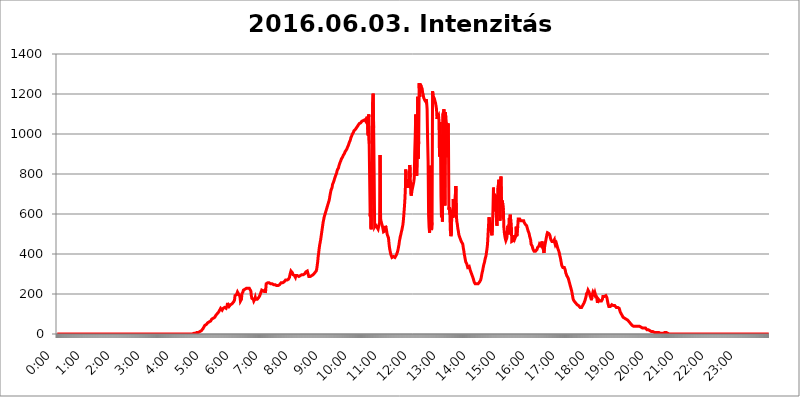
| Category | 2016.06.03. Intenzitás [W/m^2] |
|---|---|
| 0.0 | 0 |
| 0.0006944444444444445 | 0 |
| 0.001388888888888889 | 0 |
| 0.0020833333333333333 | 0 |
| 0.002777777777777778 | 0 |
| 0.003472222222222222 | 0 |
| 0.004166666666666667 | 0 |
| 0.004861111111111111 | 0 |
| 0.005555555555555556 | 0 |
| 0.0062499999999999995 | 0 |
| 0.006944444444444444 | 0 |
| 0.007638888888888889 | 0 |
| 0.008333333333333333 | 0 |
| 0.009027777777777779 | 0 |
| 0.009722222222222222 | 0 |
| 0.010416666666666666 | 0 |
| 0.011111111111111112 | 0 |
| 0.011805555555555555 | 0 |
| 0.012499999999999999 | 0 |
| 0.013194444444444444 | 0 |
| 0.013888888888888888 | 0 |
| 0.014583333333333332 | 0 |
| 0.015277777777777777 | 0 |
| 0.015972222222222224 | 0 |
| 0.016666666666666666 | 0 |
| 0.017361111111111112 | 0 |
| 0.018055555555555557 | 0 |
| 0.01875 | 0 |
| 0.019444444444444445 | 0 |
| 0.02013888888888889 | 0 |
| 0.020833333333333332 | 0 |
| 0.02152777777777778 | 0 |
| 0.022222222222222223 | 0 |
| 0.02291666666666667 | 0 |
| 0.02361111111111111 | 0 |
| 0.024305555555555556 | 0 |
| 0.024999999999999998 | 0 |
| 0.025694444444444447 | 0 |
| 0.02638888888888889 | 0 |
| 0.027083333333333334 | 0 |
| 0.027777777777777776 | 0 |
| 0.02847222222222222 | 0 |
| 0.029166666666666664 | 0 |
| 0.029861111111111113 | 0 |
| 0.030555555555555555 | 0 |
| 0.03125 | 0 |
| 0.03194444444444445 | 0 |
| 0.03263888888888889 | 0 |
| 0.03333333333333333 | 0 |
| 0.034027777777777775 | 0 |
| 0.034722222222222224 | 0 |
| 0.035416666666666666 | 0 |
| 0.036111111111111115 | 0 |
| 0.03680555555555556 | 0 |
| 0.0375 | 0 |
| 0.03819444444444444 | 0 |
| 0.03888888888888889 | 0 |
| 0.03958333333333333 | 0 |
| 0.04027777777777778 | 0 |
| 0.04097222222222222 | 0 |
| 0.041666666666666664 | 0 |
| 0.042361111111111106 | 0 |
| 0.04305555555555556 | 0 |
| 0.043750000000000004 | 0 |
| 0.044444444444444446 | 0 |
| 0.04513888888888889 | 0 |
| 0.04583333333333334 | 0 |
| 0.04652777777777778 | 0 |
| 0.04722222222222222 | 0 |
| 0.04791666666666666 | 0 |
| 0.04861111111111111 | 0 |
| 0.049305555555555554 | 0 |
| 0.049999999999999996 | 0 |
| 0.05069444444444445 | 0 |
| 0.051388888888888894 | 0 |
| 0.052083333333333336 | 0 |
| 0.05277777777777778 | 0 |
| 0.05347222222222222 | 0 |
| 0.05416666666666667 | 0 |
| 0.05486111111111111 | 0 |
| 0.05555555555555555 | 0 |
| 0.05625 | 0 |
| 0.05694444444444444 | 0 |
| 0.057638888888888885 | 0 |
| 0.05833333333333333 | 0 |
| 0.05902777777777778 | 0 |
| 0.059722222222222225 | 0 |
| 0.06041666666666667 | 0 |
| 0.061111111111111116 | 0 |
| 0.06180555555555556 | 0 |
| 0.0625 | 0 |
| 0.06319444444444444 | 0 |
| 0.06388888888888888 | 0 |
| 0.06458333333333334 | 0 |
| 0.06527777777777778 | 0 |
| 0.06597222222222222 | 0 |
| 0.06666666666666667 | 0 |
| 0.06736111111111111 | 0 |
| 0.06805555555555555 | 0 |
| 0.06874999999999999 | 0 |
| 0.06944444444444443 | 0 |
| 0.07013888888888889 | 0 |
| 0.07083333333333333 | 0 |
| 0.07152777777777779 | 0 |
| 0.07222222222222223 | 0 |
| 0.07291666666666667 | 0 |
| 0.07361111111111111 | 0 |
| 0.07430555555555556 | 0 |
| 0.075 | 0 |
| 0.07569444444444444 | 0 |
| 0.0763888888888889 | 0 |
| 0.07708333333333334 | 0 |
| 0.07777777777777778 | 0 |
| 0.07847222222222222 | 0 |
| 0.07916666666666666 | 0 |
| 0.0798611111111111 | 0 |
| 0.08055555555555556 | 0 |
| 0.08125 | 0 |
| 0.08194444444444444 | 0 |
| 0.08263888888888889 | 0 |
| 0.08333333333333333 | 0 |
| 0.08402777777777777 | 0 |
| 0.08472222222222221 | 0 |
| 0.08541666666666665 | 0 |
| 0.08611111111111112 | 0 |
| 0.08680555555555557 | 0 |
| 0.08750000000000001 | 0 |
| 0.08819444444444445 | 0 |
| 0.08888888888888889 | 0 |
| 0.08958333333333333 | 0 |
| 0.09027777777777778 | 0 |
| 0.09097222222222222 | 0 |
| 0.09166666666666667 | 0 |
| 0.09236111111111112 | 0 |
| 0.09305555555555556 | 0 |
| 0.09375 | 0 |
| 0.09444444444444444 | 0 |
| 0.09513888888888888 | 0 |
| 0.09583333333333333 | 0 |
| 0.09652777777777777 | 0 |
| 0.09722222222222222 | 0 |
| 0.09791666666666667 | 0 |
| 0.09861111111111111 | 0 |
| 0.09930555555555555 | 0 |
| 0.09999999999999999 | 0 |
| 0.10069444444444443 | 0 |
| 0.1013888888888889 | 0 |
| 0.10208333333333335 | 0 |
| 0.10277777777777779 | 0 |
| 0.10347222222222223 | 0 |
| 0.10416666666666667 | 0 |
| 0.10486111111111111 | 0 |
| 0.10555555555555556 | 0 |
| 0.10625 | 0 |
| 0.10694444444444444 | 0 |
| 0.1076388888888889 | 0 |
| 0.10833333333333334 | 0 |
| 0.10902777777777778 | 0 |
| 0.10972222222222222 | 0 |
| 0.1111111111111111 | 0 |
| 0.11180555555555556 | 0 |
| 0.11180555555555556 | 0 |
| 0.1125 | 0 |
| 0.11319444444444444 | 0 |
| 0.11388888888888889 | 0 |
| 0.11458333333333333 | 0 |
| 0.11527777777777777 | 0 |
| 0.11597222222222221 | 0 |
| 0.11666666666666665 | 0 |
| 0.1173611111111111 | 0 |
| 0.11805555555555557 | 0 |
| 0.11944444444444445 | 0 |
| 0.12013888888888889 | 0 |
| 0.12083333333333333 | 0 |
| 0.12152777777777778 | 0 |
| 0.12222222222222223 | 0 |
| 0.12291666666666667 | 0 |
| 0.12291666666666667 | 0 |
| 0.12361111111111112 | 0 |
| 0.12430555555555556 | 0 |
| 0.125 | 0 |
| 0.12569444444444444 | 0 |
| 0.12638888888888888 | 0 |
| 0.12708333333333333 | 0 |
| 0.16875 | 0 |
| 0.12847222222222224 | 0 |
| 0.12916666666666668 | 0 |
| 0.12986111111111112 | 0 |
| 0.13055555555555556 | 0 |
| 0.13125 | 0 |
| 0.13194444444444445 | 0 |
| 0.1326388888888889 | 0 |
| 0.13333333333333333 | 0 |
| 0.13402777777777777 | 0 |
| 0.13402777777777777 | 0 |
| 0.13472222222222222 | 0 |
| 0.13541666666666666 | 0 |
| 0.1361111111111111 | 0 |
| 0.13749999999999998 | 0 |
| 0.13819444444444443 | 0 |
| 0.1388888888888889 | 0 |
| 0.13958333333333334 | 0 |
| 0.14027777777777778 | 0 |
| 0.14097222222222222 | 0 |
| 0.14166666666666666 | 0 |
| 0.1423611111111111 | 0 |
| 0.14305555555555557 | 0 |
| 0.14375000000000002 | 0 |
| 0.14444444444444446 | 0 |
| 0.1451388888888889 | 0 |
| 0.1451388888888889 | 0 |
| 0.14652777777777778 | 0 |
| 0.14722222222222223 | 0 |
| 0.14791666666666667 | 0 |
| 0.1486111111111111 | 0 |
| 0.14930555555555555 | 0 |
| 0.15 | 0 |
| 0.15069444444444444 | 0 |
| 0.15138888888888888 | 0 |
| 0.15208333333333332 | 0 |
| 0.15277777777777776 | 0 |
| 0.15347222222222223 | 0 |
| 0.15416666666666667 | 0 |
| 0.15486111111111112 | 0 |
| 0.15555555555555556 | 0 |
| 0.15625 | 0 |
| 0.15694444444444444 | 0 |
| 0.15763888888888888 | 0 |
| 0.15833333333333333 | 0 |
| 0.15902777777777777 | 0 |
| 0.15972222222222224 | 0 |
| 0.16041666666666668 | 0 |
| 0.16111111111111112 | 0 |
| 0.16180555555555556 | 0 |
| 0.1625 | 0 |
| 0.16319444444444445 | 0 |
| 0.1638888888888889 | 0 |
| 0.16458333333333333 | 0 |
| 0.16527777777777777 | 0 |
| 0.16597222222222222 | 0 |
| 0.16666666666666666 | 0 |
| 0.1673611111111111 | 0 |
| 0.16805555555555554 | 0 |
| 0.16874999999999998 | 0 |
| 0.16944444444444443 | 0 |
| 0.17013888888888887 | 0 |
| 0.1708333333333333 | 0 |
| 0.17152777777777775 | 0 |
| 0.17222222222222225 | 0 |
| 0.1729166666666667 | 0 |
| 0.17361111111111113 | 0 |
| 0.17430555555555557 | 0 |
| 0.17500000000000002 | 0 |
| 0.17569444444444446 | 0 |
| 0.1763888888888889 | 0 |
| 0.17708333333333334 | 0 |
| 0.17777777777777778 | 0 |
| 0.17847222222222223 | 0 |
| 0.17916666666666667 | 0 |
| 0.1798611111111111 | 0 |
| 0.18055555555555555 | 0 |
| 0.18125 | 0 |
| 0.18194444444444444 | 0 |
| 0.1826388888888889 | 0 |
| 0.18333333333333335 | 0 |
| 0.1840277777777778 | 0 |
| 0.18472222222222223 | 0 |
| 0.18541666666666667 | 0 |
| 0.18611111111111112 | 0 |
| 0.18680555555555556 | 0 |
| 0.1875 | 0 |
| 0.18819444444444444 | 0 |
| 0.18888888888888888 | 0 |
| 0.18958333333333333 | 0 |
| 0.19027777777777777 | 0 |
| 0.1909722222222222 | 0 |
| 0.19166666666666665 | 3.525 |
| 0.19236111111111112 | 3.525 |
| 0.19305555555555554 | 3.525 |
| 0.19375 | 3.525 |
| 0.19444444444444445 | 3.525 |
| 0.1951388888888889 | 7.887 |
| 0.19583333333333333 | 7.887 |
| 0.19652777777777777 | 7.887 |
| 0.19722222222222222 | 7.887 |
| 0.19791666666666666 | 7.887 |
| 0.1986111111111111 | 7.887 |
| 0.19930555555555554 | 12.257 |
| 0.19999999999999998 | 12.257 |
| 0.20069444444444443 | 12.257 |
| 0.20138888888888887 | 12.257 |
| 0.2020833333333333 | 16.636 |
| 0.2027777777777778 | 16.636 |
| 0.2034722222222222 | 21.024 |
| 0.2041666666666667 | 25.419 |
| 0.20486111111111113 | 29.823 |
| 0.20555555555555557 | 34.234 |
| 0.20625000000000002 | 38.653 |
| 0.20694444444444446 | 43.079 |
| 0.2076388888888889 | 47.511 |
| 0.20833333333333334 | 47.511 |
| 0.20902777777777778 | 47.511 |
| 0.20972222222222223 | 51.951 |
| 0.21041666666666667 | 51.951 |
| 0.2111111111111111 | 56.398 |
| 0.21180555555555555 | 60.85 |
| 0.2125 | 60.85 |
| 0.21319444444444444 | 60.85 |
| 0.2138888888888889 | 60.85 |
| 0.21458333333333335 | 65.31 |
| 0.2152777777777778 | 65.31 |
| 0.21597222222222223 | 69.775 |
| 0.21666666666666667 | 74.246 |
| 0.21736111111111112 | 74.246 |
| 0.21805555555555556 | 78.722 |
| 0.21875 | 78.722 |
| 0.21944444444444444 | 78.722 |
| 0.22013888888888888 | 78.722 |
| 0.22083333333333333 | 83.205 |
| 0.22152777777777777 | 87.692 |
| 0.2222222222222222 | 92.184 |
| 0.22291666666666665 | 92.184 |
| 0.2236111111111111 | 96.682 |
| 0.22430555555555556 | 101.184 |
| 0.225 | 101.184 |
| 0.22569444444444445 | 105.69 |
| 0.2263888888888889 | 110.201 |
| 0.22708333333333333 | 114.716 |
| 0.22777777777777777 | 119.235 |
| 0.22847222222222222 | 123.758 |
| 0.22916666666666666 | 128.284 |
| 0.2298611111111111 | 132.814 |
| 0.23055555555555554 | 123.758 |
| 0.23124999999999998 | 119.235 |
| 0.23194444444444443 | 123.758 |
| 0.23263888888888887 | 128.284 |
| 0.2333333333333333 | 132.814 |
| 0.2340277777777778 | 128.284 |
| 0.2347222222222222 | 132.814 |
| 0.2354166666666667 | 128.284 |
| 0.23611111111111113 | 128.284 |
| 0.23680555555555557 | 128.284 |
| 0.23750000000000002 | 132.814 |
| 0.23819444444444446 | 141.884 |
| 0.2388888888888889 | 155.509 |
| 0.23958333333333334 | 146.423 |
| 0.24027777777777778 | 141.884 |
| 0.24097222222222223 | 137.347 |
| 0.24166666666666667 | 137.347 |
| 0.2423611111111111 | 141.884 |
| 0.24305555555555555 | 146.423 |
| 0.24375 | 146.423 |
| 0.24444444444444446 | 150.964 |
| 0.24513888888888888 | 150.964 |
| 0.24583333333333335 | 155.509 |
| 0.2465277777777778 | 155.509 |
| 0.24722222222222223 | 160.056 |
| 0.24791666666666667 | 160.056 |
| 0.24861111111111112 | 169.156 |
| 0.24930555555555556 | 191.937 |
| 0.25 | 191.937 |
| 0.25069444444444444 | 191.937 |
| 0.2513888888888889 | 196.497 |
| 0.2520833333333333 | 201.058 |
| 0.25277777777777777 | 210.182 |
| 0.2534722222222222 | 210.182 |
| 0.25416666666666665 | 205.62 |
| 0.2548611111111111 | 196.497 |
| 0.2555555555555556 | 196.497 |
| 0.25625000000000003 | 187.378 |
| 0.2569444444444445 | 164.605 |
| 0.2576388888888889 | 169.156 |
| 0.25833333333333336 | 173.709 |
| 0.2590277777777778 | 201.058 |
| 0.25972222222222224 | 201.058 |
| 0.2604166666666667 | 210.182 |
| 0.2611111111111111 | 219.309 |
| 0.26180555555555557 | 219.309 |
| 0.2625 | 223.873 |
| 0.26319444444444445 | 223.873 |
| 0.2638888888888889 | 228.436 |
| 0.26458333333333334 | 228.436 |
| 0.2652777777777778 | 228.436 |
| 0.2659722222222222 | 228.436 |
| 0.26666666666666666 | 228.436 |
| 0.2673611111111111 | 228.436 |
| 0.26805555555555555 | 228.436 |
| 0.26875 | 228.436 |
| 0.26944444444444443 | 228.436 |
| 0.2701388888888889 | 228.436 |
| 0.2708333333333333 | 223.873 |
| 0.27152777777777776 | 214.746 |
| 0.2722222222222222 | 191.937 |
| 0.27291666666666664 | 178.264 |
| 0.2736111111111111 | 173.709 |
| 0.2743055555555555 | 173.709 |
| 0.27499999999999997 | 173.709 |
| 0.27569444444444446 | 164.605 |
| 0.27638888888888885 | 169.156 |
| 0.27708333333333335 | 173.709 |
| 0.2777777777777778 | 182.82 |
| 0.27847222222222223 | 173.709 |
| 0.2791666666666667 | 169.156 |
| 0.2798611111111111 | 169.156 |
| 0.28055555555555556 | 173.709 |
| 0.28125 | 173.709 |
| 0.28194444444444444 | 178.264 |
| 0.2826388888888889 | 182.82 |
| 0.2833333333333333 | 187.378 |
| 0.28402777777777777 | 191.937 |
| 0.2847222222222222 | 196.497 |
| 0.28541666666666665 | 205.62 |
| 0.28611111111111115 | 210.182 |
| 0.28680555555555554 | 219.309 |
| 0.28750000000000003 | 219.309 |
| 0.2881944444444445 | 219.309 |
| 0.2888888888888889 | 214.746 |
| 0.28958333333333336 | 210.182 |
| 0.2902777777777778 | 219.309 |
| 0.29097222222222224 | 219.309 |
| 0.2916666666666667 | 205.62 |
| 0.2923611111111111 | 219.309 |
| 0.29305555555555557 | 251.251 |
| 0.29375 | 251.251 |
| 0.29444444444444445 | 255.813 |
| 0.2951388888888889 | 255.813 |
| 0.29583333333333334 | 255.813 |
| 0.2965277777777778 | 255.813 |
| 0.2972222222222222 | 255.813 |
| 0.29791666666666666 | 251.251 |
| 0.2986111111111111 | 251.251 |
| 0.29930555555555555 | 251.251 |
| 0.3 | 251.251 |
| 0.30069444444444443 | 246.689 |
| 0.3013888888888889 | 251.251 |
| 0.3020833333333333 | 251.251 |
| 0.30277777777777776 | 251.251 |
| 0.3034722222222222 | 246.689 |
| 0.30416666666666664 | 246.689 |
| 0.3048611111111111 | 246.689 |
| 0.3055555555555555 | 246.689 |
| 0.30624999999999997 | 242.127 |
| 0.3069444444444444 | 242.127 |
| 0.3076388888888889 | 242.127 |
| 0.30833333333333335 | 242.127 |
| 0.3090277777777778 | 242.127 |
| 0.30972222222222223 | 242.127 |
| 0.3104166666666667 | 246.689 |
| 0.3111111111111111 | 246.689 |
| 0.31180555555555556 | 246.689 |
| 0.3125 | 251.251 |
| 0.31319444444444444 | 251.251 |
| 0.3138888888888889 | 255.813 |
| 0.3145833333333333 | 255.813 |
| 0.31527777777777777 | 255.813 |
| 0.3159722222222222 | 255.813 |
| 0.31666666666666665 | 260.373 |
| 0.31736111111111115 | 260.373 |
| 0.31805555555555554 | 260.373 |
| 0.31875000000000003 | 260.373 |
| 0.3194444444444445 | 264.932 |
| 0.3201388888888889 | 269.49 |
| 0.32083333333333336 | 269.49 |
| 0.3215277777777778 | 269.49 |
| 0.32222222222222224 | 269.49 |
| 0.3229166666666667 | 274.047 |
| 0.3236111111111111 | 274.047 |
| 0.32430555555555557 | 274.047 |
| 0.325 | 278.603 |
| 0.32569444444444445 | 283.156 |
| 0.3263888888888889 | 296.808 |
| 0.32708333333333334 | 305.898 |
| 0.3277777777777778 | 314.98 |
| 0.3284722222222222 | 319.517 |
| 0.32916666666666666 | 314.98 |
| 0.3298611111111111 | 305.898 |
| 0.33055555555555555 | 296.808 |
| 0.33125 | 292.259 |
| 0.33194444444444443 | 292.259 |
| 0.3326388888888889 | 292.259 |
| 0.3333333333333333 | 292.259 |
| 0.3340277777777778 | 283.156 |
| 0.3347222222222222 | 292.259 |
| 0.3354166666666667 | 292.259 |
| 0.3361111111111111 | 292.259 |
| 0.3368055555555556 | 292.259 |
| 0.33749999999999997 | 287.709 |
| 0.33819444444444446 | 287.709 |
| 0.33888888888888885 | 287.709 |
| 0.33958333333333335 | 287.709 |
| 0.34027777777777773 | 287.709 |
| 0.34097222222222223 | 292.259 |
| 0.3416666666666666 | 292.259 |
| 0.3423611111111111 | 292.259 |
| 0.3430555555555555 | 296.808 |
| 0.34375 | 296.808 |
| 0.3444444444444445 | 301.354 |
| 0.3451388888888889 | 296.808 |
| 0.3458333333333334 | 301.354 |
| 0.34652777777777777 | 301.354 |
| 0.34722222222222227 | 301.354 |
| 0.34791666666666665 | 305.898 |
| 0.34861111111111115 | 310.44 |
| 0.34930555555555554 | 314.98 |
| 0.35000000000000003 | 314.98 |
| 0.3506944444444444 | 314.98 |
| 0.3513888888888889 | 310.44 |
| 0.3520833333333333 | 310.44 |
| 0.3527777777777778 | 287.709 |
| 0.3534722222222222 | 292.259 |
| 0.3541666666666667 | 292.259 |
| 0.3548611111111111 | 287.709 |
| 0.35555555555555557 | 292.259 |
| 0.35625 | 292.259 |
| 0.35694444444444445 | 292.259 |
| 0.3576388888888889 | 292.259 |
| 0.35833333333333334 | 296.808 |
| 0.3590277777777778 | 296.808 |
| 0.3597222222222222 | 301.354 |
| 0.36041666666666666 | 301.354 |
| 0.3611111111111111 | 305.898 |
| 0.36180555555555555 | 310.44 |
| 0.3625 | 310.44 |
| 0.36319444444444443 | 314.98 |
| 0.3638888888888889 | 324.052 |
| 0.3645833333333333 | 342.162 |
| 0.3652777777777778 | 360.221 |
| 0.3659722222222222 | 387.202 |
| 0.3666666666666667 | 405.108 |
| 0.3673611111111111 | 427.39 |
| 0.3680555555555556 | 445.129 |
| 0.36874999999999997 | 458.38 |
| 0.36944444444444446 | 471.582 |
| 0.37013888888888885 | 489.108 |
| 0.37083333333333335 | 506.542 |
| 0.37152777777777773 | 523.88 |
| 0.37222222222222223 | 541.121 |
| 0.3729166666666666 | 558.261 |
| 0.3736111111111111 | 571.049 |
| 0.3743055555555555 | 583.779 |
| 0.375 | 592.233 |
| 0.3756944444444445 | 596.45 |
| 0.3763888888888889 | 609.062 |
| 0.3770833333333334 | 617.436 |
| 0.37777777777777777 | 625.784 |
| 0.37847222222222227 | 629.948 |
| 0.37916666666666665 | 642.4 |
| 0.37986111111111115 | 650.667 |
| 0.38055555555555554 | 658.909 |
| 0.38125000000000003 | 667.123 |
| 0.3819444444444444 | 679.395 |
| 0.3826388888888889 | 695.666 |
| 0.3833333333333333 | 707.8 |
| 0.3840277777777778 | 719.877 |
| 0.3847222222222222 | 723.889 |
| 0.3854166666666667 | 731.896 |
| 0.3861111111111111 | 747.834 |
| 0.38680555555555557 | 751.803 |
| 0.3875 | 759.723 |
| 0.38819444444444445 | 767.62 |
| 0.3888888888888889 | 775.492 |
| 0.38958333333333334 | 783.342 |
| 0.3902777777777778 | 791.169 |
| 0.3909722222222222 | 795.074 |
| 0.39166666666666666 | 802.868 |
| 0.3923611111111111 | 814.519 |
| 0.39305555555555555 | 822.26 |
| 0.39375 | 826.123 |
| 0.39444444444444443 | 829.981 |
| 0.3951388888888889 | 841.526 |
| 0.3958333333333333 | 849.199 |
| 0.3965277777777778 | 856.855 |
| 0.3972222222222222 | 860.676 |
| 0.3979166666666667 | 868.305 |
| 0.3986111111111111 | 875.918 |
| 0.3993055555555556 | 879.719 |
| 0.39999999999999997 | 883.516 |
| 0.40069444444444446 | 887.309 |
| 0.40138888888888885 | 894.885 |
| 0.40208333333333335 | 898.668 |
| 0.40277777777777773 | 902.447 |
| 0.40347222222222223 | 909.996 |
| 0.4041666666666666 | 913.766 |
| 0.4048611111111111 | 917.534 |
| 0.4055555555555555 | 921.298 |
| 0.40625 | 925.06 |
| 0.4069444444444445 | 932.576 |
| 0.4076388888888889 | 932.576 |
| 0.4083333333333334 | 943.832 |
| 0.40902777777777777 | 947.58 |
| 0.40972222222222227 | 958.814 |
| 0.41041666666666665 | 962.555 |
| 0.41111111111111115 | 970.034 |
| 0.41180555555555554 | 981.244 |
| 0.41250000000000003 | 984.98 |
| 0.4131944444444444 | 992.448 |
| 0.4138888888888889 | 999.916 |
| 0.4145833333333333 | 1003.65 |
| 0.4152777777777778 | 1007.383 |
| 0.4159722222222222 | 1014.852 |
| 0.4166666666666667 | 1014.852 |
| 0.4173611111111111 | 1018.587 |
| 0.41805555555555557 | 1022.323 |
| 0.41875 | 1026.06 |
| 0.41944444444444445 | 1029.798 |
| 0.4201388888888889 | 1029.798 |
| 0.42083333333333334 | 1037.277 |
| 0.4215277777777778 | 1041.019 |
| 0.4222222222222222 | 1044.762 |
| 0.42291666666666666 | 1048.508 |
| 0.4236111111111111 | 1052.255 |
| 0.42430555555555555 | 1056.004 |
| 0.425 | 1056.004 |
| 0.42569444444444443 | 1056.004 |
| 0.4263888888888889 | 1059.756 |
| 0.4270833333333333 | 1063.51 |
| 0.4277777777777778 | 1059.756 |
| 0.4284722222222222 | 1059.756 |
| 0.4291666666666667 | 1067.267 |
| 0.4298611111111111 | 1067.267 |
| 0.4305555555555556 | 1071.027 |
| 0.43124999999999997 | 1071.027 |
| 0.43194444444444446 | 1071.027 |
| 0.43263888888888885 | 1063.51 |
| 0.43333333333333335 | 1074.789 |
| 0.43402777777777773 | 1078.555 |
| 0.43472222222222223 | 1086.097 |
| 0.4354166666666666 | 1089.873 |
| 0.4361111111111111 | 992.448 |
| 0.4368055555555555 | 1097.437 |
| 0.4375 | 951.327 |
| 0.4381944444444445 | 955.071 |
| 0.4388888888888889 | 588.009 |
| 0.4395833333333334 | 625.784 |
| 0.44027777777777777 | 523.88 |
| 0.44097222222222227 | 860.676 |
| 0.44166666666666665 | 675.311 |
| 0.44236111111111115 | 1158.689 |
| 0.44305555555555554 | 1201.843 |
| 0.44375000000000003 | 1029.798 |
| 0.4444444444444444 | 814.519 |
| 0.4451388888888889 | 536.82 |
| 0.4458333333333333 | 536.82 |
| 0.4465277777777778 | 545.416 |
| 0.4472222222222222 | 545.416 |
| 0.4479166666666667 | 541.121 |
| 0.4486111111111111 | 532.513 |
| 0.44930555555555557 | 528.2 |
| 0.45 | 523.88 |
| 0.45069444444444445 | 523.88 |
| 0.4513888888888889 | 528.2 |
| 0.45208333333333334 | 558.261 |
| 0.4527777777777778 | 894.885 |
| 0.4534722222222222 | 579.542 |
| 0.45416666666666666 | 562.53 |
| 0.4548611111111111 | 558.261 |
| 0.45555555555555555 | 545.416 |
| 0.45625 | 536.82 |
| 0.45694444444444443 | 523.88 |
| 0.4576388888888889 | 510.885 |
| 0.4583333333333333 | 515.223 |
| 0.4590277777777778 | 510.885 |
| 0.4597222222222222 | 515.223 |
| 0.4604166666666667 | 541.121 |
| 0.4611111111111111 | 532.513 |
| 0.4618055555555556 | 519.555 |
| 0.46249999999999997 | 502.192 |
| 0.46319444444444446 | 493.475 |
| 0.46388888888888885 | 489.108 |
| 0.46458333333333335 | 480.356 |
| 0.46527777777777773 | 453.968 |
| 0.46597222222222223 | 431.833 |
| 0.4666666666666666 | 418.492 |
| 0.4673611111111111 | 405.108 |
| 0.4680555555555555 | 396.164 |
| 0.46875 | 391.685 |
| 0.4694444444444445 | 382.715 |
| 0.4701388888888889 | 382.715 |
| 0.4708333333333334 | 382.715 |
| 0.47152777777777777 | 387.202 |
| 0.47222222222222227 | 382.715 |
| 0.47291666666666665 | 382.715 |
| 0.47361111111111115 | 382.715 |
| 0.47430555555555554 | 382.715 |
| 0.47500000000000003 | 387.202 |
| 0.4756944444444444 | 396.164 |
| 0.4763888888888889 | 400.638 |
| 0.4770833333333333 | 409.574 |
| 0.4777777777777778 | 418.492 |
| 0.4784722222222222 | 431.833 |
| 0.4791666666666667 | 445.129 |
| 0.4798611111111111 | 462.786 |
| 0.48055555555555557 | 475.972 |
| 0.48125 | 489.108 |
| 0.48194444444444445 | 497.836 |
| 0.4826388888888889 | 510.885 |
| 0.48333333333333334 | 519.555 |
| 0.4840277777777778 | 532.513 |
| 0.4847222222222222 | 545.416 |
| 0.48541666666666666 | 566.793 |
| 0.4861111111111111 | 596.45 |
| 0.48680555555555555 | 629.948 |
| 0.4875 | 667.123 |
| 0.48819444444444443 | 719.877 |
| 0.4888888888888889 | 822.26 |
| 0.4895833333333333 | 739.877 |
| 0.4902777777777778 | 731.896 |
| 0.4909722222222222 | 743.859 |
| 0.4916666666666667 | 775.492 |
| 0.4923611111111111 | 739.877 |
| 0.4930555555555556 | 731.896 |
| 0.49374999999999997 | 755.766 |
| 0.49444444444444446 | 845.365 |
| 0.49513888888888885 | 783.342 |
| 0.49583333333333335 | 703.762 |
| 0.49652777777777773 | 691.608 |
| 0.49722222222222223 | 711.832 |
| 0.4979166666666666 | 723.889 |
| 0.4986111111111111 | 735.89 |
| 0.4993055555555555 | 731.896 |
| 0.5 | 759.723 |
| 0.5006944444444444 | 779.42 |
| 0.5013888888888889 | 909.996 |
| 0.5020833333333333 | 988.714 |
| 0.5027777777777778 | 1097.437 |
| 0.5034722222222222 | 999.916 |
| 0.5041666666666667 | 791.169 |
| 0.5048611111111111 | 917.534 |
| 0.5055555555555555 | 1186.03 |
| 0.50625 | 875.918 |
| 0.5069444444444444 | 962.555 |
| 0.5076388888888889 | 1254.387 |
| 0.5083333333333333 | 1186.03 |
| 0.5090277777777777 | 1250.275 |
| 0.5097222222222222 | 1246.176 |
| 0.5104166666666666 | 1238.014 |
| 0.5111111111111112 | 1233.951 |
| 0.5118055555555555 | 1225.859 |
| 0.5125000000000001 | 1205.82 |
| 0.5131944444444444 | 1197.876 |
| 0.513888888888889 | 1182.099 |
| 0.5145833333333333 | 1182.099 |
| 0.5152777777777778 | 1170.358 |
| 0.5159722222222222 | 1170.358 |
| 0.5166666666666667 | 1162.571 |
| 0.517361111111111 | 1174.263 |
| 0.5180555555555556 | 1158.689 |
| 0.5187499999999999 | 1124.056 |
| 0.5194444444444445 | 973.772 |
| 0.5201388888888888 | 864.493 |
| 0.5208333333333334 | 592.233 |
| 0.5215277777777778 | 532.513 |
| 0.5222222222222223 | 506.542 |
| 0.5229166666666667 | 506.542 |
| 0.5236111111111111 | 841.526 |
| 0.5243055555555556 | 532.513 |
| 0.525 | 519.555 |
| 0.5256944444444445 | 558.261 |
| 0.5263888888888889 | 1213.804 |
| 0.5270833333333333 | 1193.918 |
| 0.5277777777777778 | 1186.03 |
| 0.5284722222222222 | 1186.03 |
| 0.5291666666666667 | 1174.263 |
| 0.5298611111111111 | 1162.571 |
| 0.5305555555555556 | 1154.814 |
| 0.53125 | 1150.946 |
| 0.5319444444444444 | 1124.056 |
| 0.5326388888888889 | 1074.789 |
| 0.5333333333333333 | 1086.097 |
| 0.5340277777777778 | 1086.097 |
| 0.5347222222222222 | 1093.653 |
| 0.5354166666666667 | 1067.267 |
| 0.5361111111111111 | 887.309 |
| 0.5368055555555555 | 1059.756 |
| 0.5375 | 962.555 |
| 0.5381944444444444 | 687.544 |
| 0.5388888888888889 | 583.779 |
| 0.5395833333333333 | 996.182 |
| 0.5402777777777777 | 562.53 |
| 0.5409722222222222 | 1101.226 |
| 0.5416666666666666 | 1108.816 |
| 0.5423611111111112 | 1124.056 |
| 0.5430555555555555 | 849.199 |
| 0.5437500000000001 | 642.4 |
| 0.5444444444444444 | 1108.816 |
| 0.545138888888889 | 1067.267 |
| 0.5458333333333333 | 1056.004 |
| 0.5465277777777778 | 1048.508 |
| 0.5472222222222222 | 883.516 |
| 0.5479166666666667 | 1052.255 |
| 0.548611111111111 | 1041.019 |
| 0.5493055555555556 | 621.613 |
| 0.5499999999999999 | 634.105 |
| 0.5506944444444445 | 596.45 |
| 0.5513888888888888 | 515.223 |
| 0.5520833333333334 | 489.108 |
| 0.5527777777777778 | 502.192 |
| 0.5534722222222223 | 621.613 |
| 0.5541666666666667 | 600.661 |
| 0.5548611111111111 | 579.542 |
| 0.5555555555555556 | 675.311 |
| 0.55625 | 646.537 |
| 0.5569444444444445 | 588.009 |
| 0.5576388888888889 | 592.233 |
| 0.5583333333333333 | 588.009 |
| 0.5590277777777778 | 739.877 |
| 0.5597222222222222 | 596.45 |
| 0.5604166666666667 | 562.53 |
| 0.5611111111111111 | 549.704 |
| 0.5618055555555556 | 528.2 |
| 0.5625 | 515.223 |
| 0.5631944444444444 | 497.836 |
| 0.5638888888888889 | 489.108 |
| 0.5645833333333333 | 484.735 |
| 0.5652777777777778 | 475.972 |
| 0.5659722222222222 | 471.582 |
| 0.5666666666666667 | 462.786 |
| 0.5673611111111111 | 462.786 |
| 0.5680555555555555 | 458.38 |
| 0.56875 | 449.551 |
| 0.5694444444444444 | 431.833 |
| 0.5701388888888889 | 418.492 |
| 0.5708333333333333 | 400.638 |
| 0.5715277777777777 | 387.202 |
| 0.5722222222222222 | 373.729 |
| 0.5729166666666666 | 360.221 |
| 0.5736111111111112 | 355.712 |
| 0.5743055555555555 | 351.198 |
| 0.5750000000000001 | 342.162 |
| 0.5756944444444444 | 333.113 |
| 0.576388888888889 | 333.113 |
| 0.5770833333333333 | 333.113 |
| 0.5777777777777778 | 337.639 |
| 0.5784722222222222 | 328.584 |
| 0.5791666666666667 | 319.517 |
| 0.579861111111111 | 314.98 |
| 0.5805555555555556 | 305.898 |
| 0.5812499999999999 | 301.354 |
| 0.5819444444444445 | 292.259 |
| 0.5826388888888888 | 287.709 |
| 0.5833333333333334 | 278.603 |
| 0.5840277777777778 | 269.49 |
| 0.5847222222222223 | 260.373 |
| 0.5854166666666667 | 255.813 |
| 0.5861111111111111 | 251.251 |
| 0.5868055555555556 | 251.251 |
| 0.5875 | 251.251 |
| 0.5881944444444445 | 251.251 |
| 0.5888888888888889 | 251.251 |
| 0.5895833333333333 | 251.251 |
| 0.5902777777777778 | 251.251 |
| 0.5909722222222222 | 255.813 |
| 0.5916666666666667 | 255.813 |
| 0.5923611111111111 | 260.373 |
| 0.5930555555555556 | 264.932 |
| 0.59375 | 269.49 |
| 0.5944444444444444 | 278.603 |
| 0.5951388888888889 | 292.259 |
| 0.5958333333333333 | 305.898 |
| 0.5965277777777778 | 314.98 |
| 0.5972222222222222 | 328.584 |
| 0.5979166666666667 | 342.162 |
| 0.5986111111111111 | 351.198 |
| 0.5993055555555555 | 360.221 |
| 0.6 | 373.729 |
| 0.6006944444444444 | 382.715 |
| 0.6013888888888889 | 391.685 |
| 0.6020833333333333 | 409.574 |
| 0.6027777777777777 | 427.39 |
| 0.6034722222222222 | 449.551 |
| 0.6041666666666666 | 449.551 |
| 0.6048611111111112 | 541.121 |
| 0.6055555555555555 | 583.779 |
| 0.6062500000000001 | 566.793 |
| 0.6069444444444444 | 515.223 |
| 0.607638888888889 | 515.223 |
| 0.6083333333333333 | 532.513 |
| 0.6090277777777778 | 502.192 |
| 0.6097222222222222 | 493.475 |
| 0.6104166666666667 | 545.416 |
| 0.611111111111111 | 621.613 |
| 0.6118055555555556 | 731.896 |
| 0.6124999999999999 | 613.252 |
| 0.6131944444444445 | 699.717 |
| 0.6138888888888888 | 695.666 |
| 0.6145833333333334 | 687.544 |
| 0.6152777777777778 | 634.105 |
| 0.6159722222222223 | 575.299 |
| 0.6166666666666667 | 541.121 |
| 0.6173611111111111 | 667.123 |
| 0.6180555555555556 | 735.89 |
| 0.61875 | 747.834 |
| 0.6194444444444445 | 771.559 |
| 0.6201388888888889 | 707.8 |
| 0.6208333333333333 | 566.793 |
| 0.6215277777777778 | 596.45 |
| 0.6222222222222222 | 787.258 |
| 0.6229166666666667 | 683.473 |
| 0.6236111111111111 | 634.105 |
| 0.6243055555555556 | 667.123 |
| 0.625 | 671.22 |
| 0.6256944444444444 | 617.436 |
| 0.6263888888888889 | 532.513 |
| 0.6270833333333333 | 506.542 |
| 0.6277777777777778 | 489.108 |
| 0.6284722222222222 | 475.972 |
| 0.6291666666666667 | 467.187 |
| 0.6298611111111111 | 471.582 |
| 0.6305555555555555 | 480.356 |
| 0.63125 | 484.735 |
| 0.6319444444444444 | 541.121 |
| 0.6326388888888889 | 510.885 |
| 0.6333333333333333 | 497.836 |
| 0.6340277777777777 | 579.542 |
| 0.6347222222222222 | 571.049 |
| 0.6354166666666666 | 596.45 |
| 0.6361111111111112 | 562.53 |
| 0.6368055555555555 | 549.704 |
| 0.6375000000000001 | 462.786 |
| 0.6381944444444444 | 458.38 |
| 0.638888888888889 | 458.38 |
| 0.6395833333333333 | 467.187 |
| 0.6402777777777778 | 493.475 |
| 0.6409722222222222 | 489.108 |
| 0.6416666666666667 | 475.972 |
| 0.642361111111111 | 471.582 |
| 0.6430555555555556 | 489.108 |
| 0.6437499999999999 | 536.82 |
| 0.6444444444444445 | 489.108 |
| 0.6451388888888888 | 489.108 |
| 0.6458333333333334 | 536.82 |
| 0.6465277777777778 | 575.299 |
| 0.6472222222222223 | 579.542 |
| 0.6479166666666667 | 575.299 |
| 0.6486111111111111 | 575.299 |
| 0.6493055555555556 | 571.049 |
| 0.65 | 566.793 |
| 0.6506944444444445 | 562.53 |
| 0.6513888888888889 | 566.793 |
| 0.6520833333333333 | 566.793 |
| 0.6527777777777778 | 566.793 |
| 0.6534722222222222 | 566.793 |
| 0.6541666666666667 | 566.793 |
| 0.6548611111111111 | 558.261 |
| 0.6555555555555556 | 553.986 |
| 0.65625 | 549.704 |
| 0.6569444444444444 | 549.704 |
| 0.6576388888888889 | 545.416 |
| 0.6583333333333333 | 541.121 |
| 0.6590277777777778 | 536.82 |
| 0.6597222222222222 | 523.88 |
| 0.6604166666666667 | 515.223 |
| 0.6611111111111111 | 510.885 |
| 0.6618055555555555 | 502.192 |
| 0.6625 | 489.108 |
| 0.6631944444444444 | 480.356 |
| 0.6638888888888889 | 471.582 |
| 0.6645833333333333 | 449.551 |
| 0.6652777777777777 | 445.129 |
| 0.6659722222222222 | 440.702 |
| 0.6666666666666666 | 431.833 |
| 0.6673611111111111 | 422.943 |
| 0.6680555555555556 | 418.492 |
| 0.6687500000000001 | 414.035 |
| 0.6694444444444444 | 414.035 |
| 0.6701388888888888 | 414.035 |
| 0.6708333333333334 | 414.035 |
| 0.6715277777777778 | 418.492 |
| 0.6722222222222222 | 418.492 |
| 0.6729166666666666 | 422.943 |
| 0.6736111111111112 | 431.833 |
| 0.6743055555555556 | 431.833 |
| 0.6749999999999999 | 436.27 |
| 0.6756944444444444 | 440.702 |
| 0.6763888888888889 | 449.551 |
| 0.6770833333333334 | 449.551 |
| 0.6777777777777777 | 445.129 |
| 0.6784722222222223 | 440.702 |
| 0.6791666666666667 | 449.551 |
| 0.6798611111111111 | 462.786 |
| 0.6805555555555555 | 445.129 |
| 0.68125 | 445.129 |
| 0.6819444444444445 | 418.492 |
| 0.6826388888888889 | 405.108 |
| 0.6833333333333332 | 431.833 |
| 0.6840277777777778 | 445.129 |
| 0.6847222222222222 | 458.38 |
| 0.6854166666666667 | 471.582 |
| 0.686111111111111 | 484.735 |
| 0.6868055555555556 | 497.836 |
| 0.6875 | 506.542 |
| 0.6881944444444444 | 506.542 |
| 0.688888888888889 | 506.542 |
| 0.6895833333333333 | 502.192 |
| 0.6902777777777778 | 497.836 |
| 0.6909722222222222 | 493.475 |
| 0.6916666666666668 | 480.356 |
| 0.6923611111111111 | 471.582 |
| 0.6930555555555555 | 467.187 |
| 0.69375 | 462.786 |
| 0.6944444444444445 | 462.786 |
| 0.6951388888888889 | 458.38 |
| 0.6958333333333333 | 462.786 |
| 0.6965277777777777 | 458.38 |
| 0.6972222222222223 | 471.582 |
| 0.6979166666666666 | 453.968 |
| 0.6986111111111111 | 445.129 |
| 0.6993055555555556 | 445.129 |
| 0.7000000000000001 | 453.968 |
| 0.7006944444444444 | 449.551 |
| 0.7013888888888888 | 436.27 |
| 0.7020833333333334 | 427.39 |
| 0.7027777777777778 | 422.943 |
| 0.7034722222222222 | 414.035 |
| 0.7041666666666666 | 405.108 |
| 0.7048611111111112 | 391.685 |
| 0.7055555555555556 | 382.715 |
| 0.7062499999999999 | 369.23 |
| 0.7069444444444444 | 355.712 |
| 0.7076388888888889 | 342.162 |
| 0.7083333333333334 | 337.639 |
| 0.7090277777777777 | 333.113 |
| 0.7097222222222223 | 333.113 |
| 0.7104166666666667 | 337.639 |
| 0.7111111111111111 | 333.113 |
| 0.7118055555555555 | 328.584 |
| 0.7125 | 319.517 |
| 0.7131944444444445 | 305.898 |
| 0.7138888888888889 | 301.354 |
| 0.7145833333333332 | 292.259 |
| 0.7152777777777778 | 292.259 |
| 0.7159722222222222 | 287.709 |
| 0.7166666666666667 | 278.603 |
| 0.717361111111111 | 274.047 |
| 0.7180555555555556 | 260.373 |
| 0.71875 | 251.251 |
| 0.7194444444444444 | 242.127 |
| 0.720138888888889 | 233 |
| 0.7208333333333333 | 223.873 |
| 0.7215277777777778 | 214.746 |
| 0.7222222222222222 | 201.058 |
| 0.7229166666666668 | 187.378 |
| 0.7236111111111111 | 173.709 |
| 0.7243055555555555 | 173.709 |
| 0.725 | 164.605 |
| 0.7256944444444445 | 164.605 |
| 0.7263888888888889 | 160.056 |
| 0.7270833333333333 | 155.509 |
| 0.7277777777777777 | 150.964 |
| 0.7284722222222223 | 150.964 |
| 0.7291666666666666 | 146.423 |
| 0.7298611111111111 | 141.884 |
| 0.7305555555555556 | 141.884 |
| 0.7312500000000001 | 141.884 |
| 0.7319444444444444 | 137.347 |
| 0.7326388888888888 | 137.347 |
| 0.7333333333333334 | 132.814 |
| 0.7340277777777778 | 132.814 |
| 0.7347222222222222 | 132.814 |
| 0.7354166666666666 | 132.814 |
| 0.7361111111111112 | 137.347 |
| 0.7368055555555556 | 137.347 |
| 0.7374999999999999 | 146.423 |
| 0.7381944444444444 | 150.964 |
| 0.7388888888888889 | 155.509 |
| 0.7395833333333334 | 160.056 |
| 0.7402777777777777 | 169.156 |
| 0.7409722222222223 | 178.264 |
| 0.7416666666666667 | 187.378 |
| 0.7423611111111111 | 201.058 |
| 0.7430555555555555 | 205.62 |
| 0.74375 | 210.182 |
| 0.7444444444444445 | 219.309 |
| 0.7451388888888889 | 219.309 |
| 0.7458333333333332 | 210.182 |
| 0.7465277777777778 | 201.058 |
| 0.7472222222222222 | 191.937 |
| 0.7479166666666667 | 187.378 |
| 0.748611111111111 | 178.264 |
| 0.7493055555555556 | 169.156 |
| 0.75 | 191.937 |
| 0.7506944444444444 | 201.058 |
| 0.751388888888889 | 210.182 |
| 0.7520833333333333 | 210.182 |
| 0.7527777777777778 | 214.746 |
| 0.7534722222222222 | 196.497 |
| 0.7541666666666668 | 205.62 |
| 0.7548611111111111 | 196.497 |
| 0.7555555555555555 | 196.497 |
| 0.75625 | 187.378 |
| 0.7569444444444445 | 173.709 |
| 0.7576388888888889 | 155.509 |
| 0.7583333333333333 | 160.056 |
| 0.7590277777777777 | 173.709 |
| 0.7597222222222223 | 173.709 |
| 0.7604166666666666 | 169.156 |
| 0.7611111111111111 | 164.605 |
| 0.7618055555555556 | 164.605 |
| 0.7625000000000001 | 164.605 |
| 0.7631944444444444 | 164.605 |
| 0.7638888888888888 | 164.605 |
| 0.7645833333333334 | 173.709 |
| 0.7652777777777778 | 187.378 |
| 0.7659722222222222 | 187.378 |
| 0.7666666666666666 | 187.378 |
| 0.7673611111111112 | 187.378 |
| 0.7680555555555556 | 187.378 |
| 0.7687499999999999 | 191.937 |
| 0.7694444444444444 | 191.937 |
| 0.7701388888888889 | 191.937 |
| 0.7708333333333334 | 182.82 |
| 0.7715277777777777 | 169.156 |
| 0.7722222222222223 | 155.509 |
| 0.7729166666666667 | 146.423 |
| 0.7736111111111111 | 137.347 |
| 0.7743055555555555 | 137.347 |
| 0.775 | 141.884 |
| 0.7756944444444445 | 137.347 |
| 0.7763888888888889 | 137.347 |
| 0.7770833333333332 | 141.884 |
| 0.7777777777777778 | 146.423 |
| 0.7784722222222222 | 146.423 |
| 0.7791666666666667 | 141.884 |
| 0.779861111111111 | 141.884 |
| 0.7805555555555556 | 141.884 |
| 0.78125 | 141.884 |
| 0.7819444444444444 | 141.884 |
| 0.782638888888889 | 137.347 |
| 0.7833333333333333 | 137.347 |
| 0.7840277777777778 | 132.814 |
| 0.7847222222222222 | 132.814 |
| 0.7854166666666668 | 132.814 |
| 0.7861111111111111 | 132.814 |
| 0.7868055555555555 | 128.284 |
| 0.7875 | 128.284 |
| 0.7881944444444445 | 128.284 |
| 0.7888888888888889 | 119.235 |
| 0.7895833333333333 | 110.201 |
| 0.7902777777777777 | 105.69 |
| 0.7909722222222223 | 101.184 |
| 0.7916666666666666 | 96.682 |
| 0.7923611111111111 | 92.184 |
| 0.7930555555555556 | 87.692 |
| 0.7937500000000001 | 83.205 |
| 0.7944444444444444 | 83.205 |
| 0.7951388888888888 | 83.205 |
| 0.7958333333333334 | 78.722 |
| 0.7965277777777778 | 78.722 |
| 0.7972222222222222 | 74.246 |
| 0.7979166666666666 | 74.246 |
| 0.7986111111111112 | 74.246 |
| 0.7993055555555556 | 74.246 |
| 0.7999999999999999 | 69.775 |
| 0.8006944444444444 | 69.775 |
| 0.8013888888888889 | 65.31 |
| 0.8020833333333334 | 60.85 |
| 0.8027777777777777 | 56.398 |
| 0.8034722222222223 | 56.398 |
| 0.8041666666666667 | 51.951 |
| 0.8048611111111111 | 47.511 |
| 0.8055555555555555 | 47.511 |
| 0.80625 | 43.079 |
| 0.8069444444444445 | 43.079 |
| 0.8076388888888889 | 38.653 |
| 0.8083333333333332 | 38.653 |
| 0.8090277777777778 | 38.653 |
| 0.8097222222222222 | 38.653 |
| 0.8104166666666667 | 38.653 |
| 0.811111111111111 | 38.653 |
| 0.8118055555555556 | 38.653 |
| 0.8125 | 38.653 |
| 0.8131944444444444 | 38.653 |
| 0.813888888888889 | 38.653 |
| 0.8145833333333333 | 38.653 |
| 0.8152777777777778 | 38.653 |
| 0.8159722222222222 | 38.653 |
| 0.8166666666666668 | 38.653 |
| 0.8173611111111111 | 34.234 |
| 0.8180555555555555 | 34.234 |
| 0.81875 | 34.234 |
| 0.8194444444444445 | 34.234 |
| 0.8201388888888889 | 29.823 |
| 0.8208333333333333 | 29.823 |
| 0.8215277777777777 | 29.823 |
| 0.8222222222222223 | 29.823 |
| 0.8229166666666666 | 29.823 |
| 0.8236111111111111 | 29.823 |
| 0.8243055555555556 | 29.823 |
| 0.8250000000000001 | 29.823 |
| 0.8256944444444444 | 25.419 |
| 0.8263888888888888 | 25.419 |
| 0.8270833333333334 | 21.024 |
| 0.8277777777777778 | 21.024 |
| 0.8284722222222222 | 21.024 |
| 0.8291666666666666 | 21.024 |
| 0.8298611111111112 | 21.024 |
| 0.8305555555555556 | 21.024 |
| 0.8312499999999999 | 16.636 |
| 0.8319444444444444 | 16.636 |
| 0.8326388888888889 | 16.636 |
| 0.8333333333333334 | 12.257 |
| 0.8340277777777777 | 12.257 |
| 0.8347222222222223 | 12.257 |
| 0.8354166666666667 | 12.257 |
| 0.8361111111111111 | 12.257 |
| 0.8368055555555555 | 12.257 |
| 0.8375 | 7.887 |
| 0.8381944444444445 | 7.887 |
| 0.8388888888888889 | 7.887 |
| 0.8395833333333332 | 7.887 |
| 0.8402777777777778 | 7.887 |
| 0.8409722222222222 | 7.887 |
| 0.8416666666666667 | 7.887 |
| 0.842361111111111 | 7.887 |
| 0.8430555555555556 | 7.887 |
| 0.84375 | 7.887 |
| 0.8444444444444444 | 7.887 |
| 0.845138888888889 | 3.525 |
| 0.8458333333333333 | 3.525 |
| 0.8465277777777778 | 3.525 |
| 0.8472222222222222 | 3.525 |
| 0.8479166666666668 | 3.525 |
| 0.8486111111111111 | 3.525 |
| 0.8493055555555555 | 3.525 |
| 0.85 | 3.525 |
| 0.8506944444444445 | 7.887 |
| 0.8513888888888889 | 7.887 |
| 0.8520833333333333 | 7.887 |
| 0.8527777777777777 | 7.887 |
| 0.8534722222222223 | 7.887 |
| 0.8541666666666666 | 7.887 |
| 0.8548611111111111 | 7.887 |
| 0.8555555555555556 | 7.887 |
| 0.8562500000000001 | 3.525 |
| 0.8569444444444444 | 3.525 |
| 0.8576388888888888 | 3.525 |
| 0.8583333333333334 | 0 |
| 0.8590277777777778 | 0 |
| 0.8597222222222222 | 0 |
| 0.8604166666666666 | 0 |
| 0.8611111111111112 | 0 |
| 0.8618055555555556 | 0 |
| 0.8624999999999999 | 0 |
| 0.8631944444444444 | 0 |
| 0.8638888888888889 | 0 |
| 0.8645833333333334 | 0 |
| 0.8652777777777777 | 0 |
| 0.8659722222222223 | 0 |
| 0.8666666666666667 | 0 |
| 0.8673611111111111 | 0 |
| 0.8680555555555555 | 0 |
| 0.86875 | 0 |
| 0.8694444444444445 | 0 |
| 0.8701388888888889 | 0 |
| 0.8708333333333332 | 0 |
| 0.8715277777777778 | 0 |
| 0.8722222222222222 | 0 |
| 0.8729166666666667 | 0 |
| 0.873611111111111 | 0 |
| 0.8743055555555556 | 0 |
| 0.875 | 0 |
| 0.8756944444444444 | 0 |
| 0.876388888888889 | 0 |
| 0.8770833333333333 | 0 |
| 0.8777777777777778 | 0 |
| 0.8784722222222222 | 0 |
| 0.8791666666666668 | 0 |
| 0.8798611111111111 | 0 |
| 0.8805555555555555 | 0 |
| 0.88125 | 0 |
| 0.8819444444444445 | 0 |
| 0.8826388888888889 | 0 |
| 0.8833333333333333 | 0 |
| 0.8840277777777777 | 0 |
| 0.8847222222222223 | 0 |
| 0.8854166666666666 | 0 |
| 0.8861111111111111 | 0 |
| 0.8868055555555556 | 0 |
| 0.8875000000000001 | 0 |
| 0.8881944444444444 | 0 |
| 0.8888888888888888 | 0 |
| 0.8895833333333334 | 0 |
| 0.8902777777777778 | 0 |
| 0.8909722222222222 | 0 |
| 0.8916666666666666 | 0 |
| 0.8923611111111112 | 0 |
| 0.8930555555555556 | 0 |
| 0.8937499999999999 | 0 |
| 0.8944444444444444 | 0 |
| 0.8951388888888889 | 0 |
| 0.8958333333333334 | 0 |
| 0.8965277777777777 | 0 |
| 0.8972222222222223 | 0 |
| 0.8979166666666667 | 0 |
| 0.8986111111111111 | 0 |
| 0.8993055555555555 | 0 |
| 0.9 | 0 |
| 0.9006944444444445 | 0 |
| 0.9013888888888889 | 0 |
| 0.9020833333333332 | 0 |
| 0.9027777777777778 | 0 |
| 0.9034722222222222 | 0 |
| 0.9041666666666667 | 0 |
| 0.904861111111111 | 0 |
| 0.9055555555555556 | 0 |
| 0.90625 | 0 |
| 0.9069444444444444 | 0 |
| 0.907638888888889 | 0 |
| 0.9083333333333333 | 0 |
| 0.9090277777777778 | 0 |
| 0.9097222222222222 | 0 |
| 0.9104166666666668 | 0 |
| 0.9111111111111111 | 0 |
| 0.9118055555555555 | 0 |
| 0.9125 | 0 |
| 0.9131944444444445 | 0 |
| 0.9138888888888889 | 0 |
| 0.9145833333333333 | 0 |
| 0.9152777777777777 | 0 |
| 0.9159722222222223 | 0 |
| 0.9166666666666666 | 0 |
| 0.9173611111111111 | 0 |
| 0.9180555555555556 | 0 |
| 0.9187500000000001 | 0 |
| 0.9194444444444444 | 0 |
| 0.9201388888888888 | 0 |
| 0.9208333333333334 | 0 |
| 0.9215277777777778 | 0 |
| 0.9222222222222222 | 0 |
| 0.9229166666666666 | 0 |
| 0.9236111111111112 | 0 |
| 0.9243055555555556 | 0 |
| 0.9249999999999999 | 0 |
| 0.9256944444444444 | 0 |
| 0.9263888888888889 | 0 |
| 0.9270833333333334 | 0 |
| 0.9277777777777777 | 0 |
| 0.9284722222222223 | 0 |
| 0.9291666666666667 | 0 |
| 0.9298611111111111 | 0 |
| 0.9305555555555555 | 0 |
| 0.93125 | 0 |
| 0.9319444444444445 | 0 |
| 0.9326388888888889 | 0 |
| 0.9333333333333332 | 0 |
| 0.9340277777777778 | 0 |
| 0.9347222222222222 | 0 |
| 0.9354166666666667 | 0 |
| 0.936111111111111 | 0 |
| 0.9368055555555556 | 0 |
| 0.9375 | 0 |
| 0.9381944444444444 | 0 |
| 0.938888888888889 | 0 |
| 0.9395833333333333 | 0 |
| 0.9402777777777778 | 0 |
| 0.9409722222222222 | 0 |
| 0.9416666666666668 | 0 |
| 0.9423611111111111 | 0 |
| 0.9430555555555555 | 0 |
| 0.94375 | 0 |
| 0.9444444444444445 | 0 |
| 0.9451388888888889 | 0 |
| 0.9458333333333333 | 0 |
| 0.9465277777777777 | 0 |
| 0.9472222222222223 | 0 |
| 0.9479166666666666 | 0 |
| 0.9486111111111111 | 0 |
| 0.9493055555555556 | 0 |
| 0.9500000000000001 | 0 |
| 0.9506944444444444 | 0 |
| 0.9513888888888888 | 0 |
| 0.9520833333333334 | 0 |
| 0.9527777777777778 | 0 |
| 0.9534722222222222 | 0 |
| 0.9541666666666666 | 0 |
| 0.9548611111111112 | 0 |
| 0.9555555555555556 | 0 |
| 0.9562499999999999 | 0 |
| 0.9569444444444444 | 0 |
| 0.9576388888888889 | 0 |
| 0.9583333333333334 | 0 |
| 0.9590277777777777 | 0 |
| 0.9597222222222223 | 0 |
| 0.9604166666666667 | 0 |
| 0.9611111111111111 | 0 |
| 0.9618055555555555 | 0 |
| 0.9625 | 0 |
| 0.9631944444444445 | 0 |
| 0.9638888888888889 | 0 |
| 0.9645833333333332 | 0 |
| 0.9652777777777778 | 0 |
| 0.9659722222222222 | 0 |
| 0.9666666666666667 | 0 |
| 0.967361111111111 | 0 |
| 0.9680555555555556 | 0 |
| 0.96875 | 0 |
| 0.9694444444444444 | 0 |
| 0.970138888888889 | 0 |
| 0.9708333333333333 | 0 |
| 0.9715277777777778 | 0 |
| 0.9722222222222222 | 0 |
| 0.9729166666666668 | 0 |
| 0.9736111111111111 | 0 |
| 0.9743055555555555 | 0 |
| 0.975 | 0 |
| 0.9756944444444445 | 0 |
| 0.9763888888888889 | 0 |
| 0.9770833333333333 | 0 |
| 0.9777777777777777 | 0 |
| 0.9784722222222223 | 0 |
| 0.9791666666666666 | 0 |
| 0.9798611111111111 | 0 |
| 0.9805555555555556 | 0 |
| 0.9812500000000001 | 0 |
| 0.9819444444444444 | 0 |
| 0.9826388888888888 | 0 |
| 0.9833333333333334 | 0 |
| 0.9840277777777778 | 0 |
| 0.9847222222222222 | 0 |
| 0.9854166666666666 | 0 |
| 0.9861111111111112 | 0 |
| 0.9868055555555556 | 0 |
| 0.9874999999999999 | 0 |
| 0.9881944444444444 | 0 |
| 0.9888888888888889 | 0 |
| 0.9895833333333334 | 0 |
| 0.9902777777777777 | 0 |
| 0.9909722222222223 | 0 |
| 0.9916666666666667 | 0 |
| 0.9923611111111111 | 0 |
| 0.9930555555555555 | 0 |
| 0.99375 | 0 |
| 0.9944444444444445 | 0 |
| 0.9951388888888889 | 0 |
| 0.9958333333333332 | 0 |
| 0.9965277777777778 | 0 |
| 0.9972222222222222 | 0 |
| 0.9979166666666667 | 0 |
| 0.998611111111111 | 0 |
| 0.9993055555555556 | 0 |